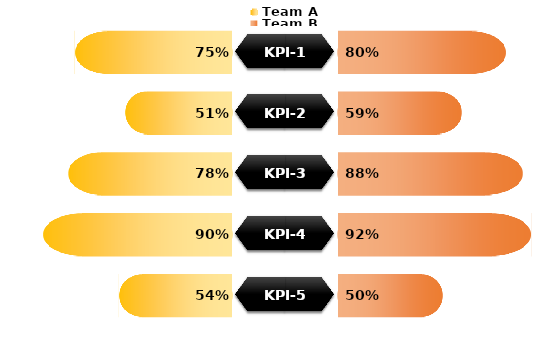
| Category | Team A Blank Area | Team A | KPI Name | Team B | Team B Blank Area |
|---|---|---|---|---|---|
| KPI-1 | 0.25 | 0.75 | 0.5 | 0.8 | 0.2 |
| KPI-2 | 0.49 | 0.51 | 0.5 | 0.59 | 0.41 |
| KPI-3 | 0.22 | 0.78 | 0.5 | 0.88 | 0.12 |
| KPI-4 | 0.1 | 0.9 | 0.5 | 0.92 | 0.08 |
| KPI-5 | 0.46 | 0.54 | 0.5 | 0.5 | 0.5 |